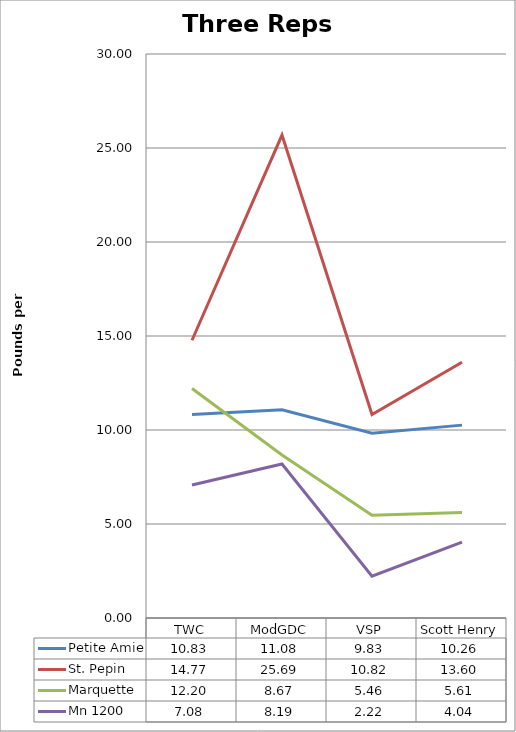
| Category | Petite Amie | St. Pepin | Marquette | Mn 1200 |
|---|---|---|---|---|
| 0 | 10.826 | 14.775 | 12.204 | 7.078 |
| 1 | 11.078 | 25.689 | 8.67 | 8.191 |
| 2 | 9.826 | 10.822 | 5.463 | 2.224 |
| 3 | 10.259 | 13.6 | 5.611 | 4.037 |